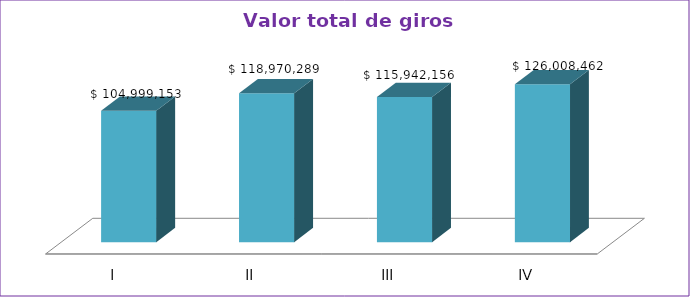
| Category | Series 0 |
|---|---|
| I | 104999153 |
| II | 118970289 |
| III | 115942156 |
| IV | 126008462 |